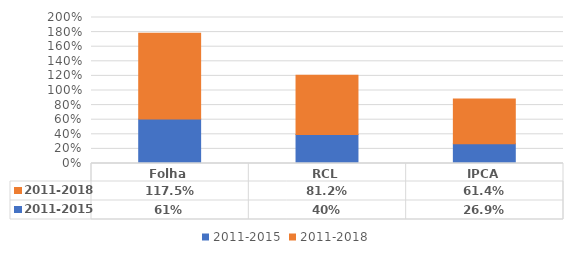
| Category | 2011-2015 | 2011-2018 |
|---|---|---|
| Folha | 0.609 | 1.175 |
| RCL | 0.398 | 0.812 |
| IPCA | 0.269 | 0.614 |